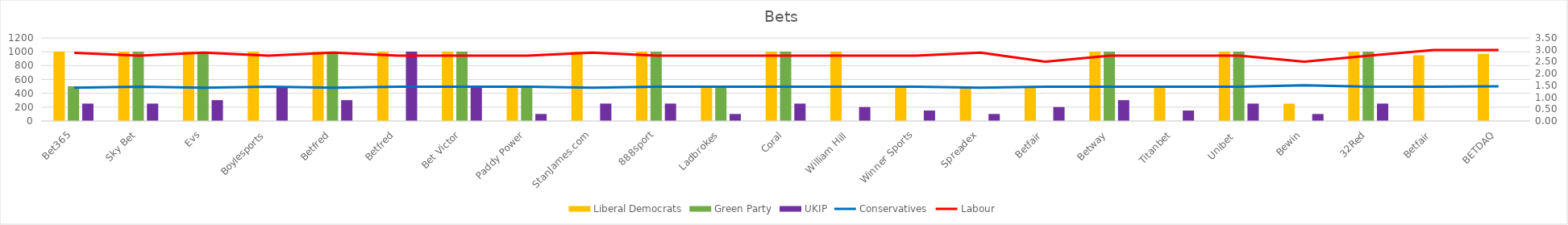
| Category | Liberal Democrats | Green Party | UKIP |
|---|---|---|---|
| Bet365 | 1001 | 501 | 251 |
| Sky Bet | 1001 | 1001 | 251 |
| Evs | 1001 | 1001 | 301 |
| Boylesports | 1001 | 0 | 501 |
| Betfred | 1001 | 1001 | 301 |
| Betfred | 1001 | 0 | 1001 |
|  Bet Victor | 1001 | 1001 | 501 |
|  Paddy Power | 501 | 501 | 101 |
|  StanJames.com | 1001 | 0 | 251 |
| 888sport | 1001 | 1001 | 251 |
| Ladbrokes | 501 | 501 | 101 |
| Coral | 1001 | 1001 | 251 |
| William Hill | 1001 | 0 | 201 |
| Winner Sports | 501 | 0 | 151 |
| Spreadex | 501 | 0 | 101 |
| Betfair | 501 | 0 | 201 |
| Betway | 1001 | 1001 | 301 |
| Titanbet | 501 | 0 | 151 |
| Unibet  | 1001 | 1001 | 251 |
| Bewin | 251 | 0 | 101 |
| 32Red | 1001 | 1001 | 251 |
| Betfair | 950 | 0 | 0 |
| BETDAQ | 970 | 0 | 0 |